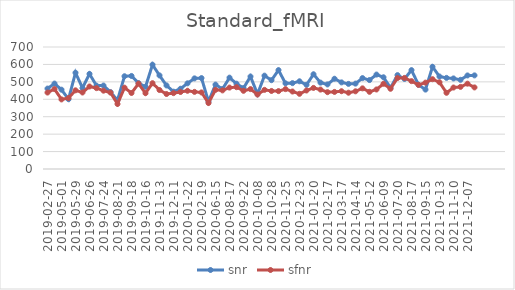
| Category | snr | sfnr |
|---|---|---|
| 2019-02-27 | 461.432 | 438.729 |
| 2019-04-03 | 490.146 | 458.722 |
| 2019-05-01 | 455.075 | 399.248 |
| 2019-05-15 | 400.65 | 407.241 |
| 2019-05-29 | 552.399 | 451.379 |
| 2019-06-12 | 464.698 | 439.009 |
| 2019-06-26 | 545.666 | 473.433 |
| 2019-07-08 | 478.159 | 464.034 |
| 2019-07-24 | 478.738 | 449.484 |
| 2019-08-07 | 441.214 | 438.544 |
| 2019-08-21 | 394.793 | 373.033 |
| 2019-09-04 | 532.233 | 466.613 |
| 2019-09-18 | 533.837 | 436.23 |
| 2019-10-04 | 493.005 | 489.764 |
| 2019-10-16 | 471.715 | 434.766 |
| 2019-10-30 | 598.517 | 492.395 |
| 2019-11-13 | 536.842 | 453.083 |
| 2019-11-27 | 479.42 | 430.281 |
| 2019-12-11 | 443.791 | 435.315 |
| 2020-01-08 | 460.467 | 441.715 |
| 2020-01-22 | 491.578 | 448.905 |
| 2020-02-05 | 519.903 | 442.596 |
| 2020-02-19 | 521.603 | 439.303 |
| 2020-03-04 | 386.86 | 378.362 |
| 2020-06-15 | 484.283 | 454.371 |
| 2020-07-20 | 459.078 | 451.037 |
| 2020-08-17 | 524.152 | 467.182 |
| 2020-09-01 | 489.576 | 469.409 |
| 2020-09-22 | 464.346 | 448.661 |
| 2020-10-02 | 530.645 | 458.447 |
| 2020-10-08 | 429.908 | 427.305 |
| 2020-10-14 | 535.542 | 454.114 |
| 2020-10-28 | 509.605 | 447.776 |
| 2020-11-09 | 567.333 | 446.982 |
| 2020-11-25 | 491.36 | 458.228 |
| 2020-12-09 | 492.775 | 444.548 |
| 2020-12-23 | 503.235 | 431.429 |
| 2021-01-06 | 482.947 | 450.478 |
| 2021-01-20 | 543.612 | 465.267 |
| 2021-02-04 | 495.644 | 455.754 |
| 2021-02-17 | 485.31 | 440.838 |
| 2021-03-03 | 517.855 | 442.27 |
| 2021-03-17 | 496.962 | 446.332 |
| 2021-03-31 | 488.326 | 437.731 |
| 2021-04-14 | 490.015 | 445.78 |
| 2021-04-28 | 521.593 | 462.689 |
| 2021-05-12 | 510.319 | 442.838 |
| 2021-05-26 | 541.852 | 456.271 |
| 2021-06-09 | 526.202 | 489.084 |
| 2021-07-01 | 465.662 | 460.266 |
| 2021-07-20 | 538.735 | 521.893 |
| 2021-08-03 | 516.78 | 522.633 |
| 2021-08-17 | 567.209 | 504.116 |
| 2021-08-31 | 483.2 | 482.663 |
| 2021-09-15 | 455.716 | 495.625 |
| 2021-10-04 | 586.431 | 515.262 |
| 2021-10-13 | 530.627 | 497.484 |
| 2021-10-28 | 522.807 | 437.225 |
| 2021-11-10 | 519.606 | 467.458 |
| 2021-11-22 | 511.77 | 471.171 |
| 2021-12-07 | 536.794 | 489.536 |
| 2021-12-20 | 537.123 | 468.051 |